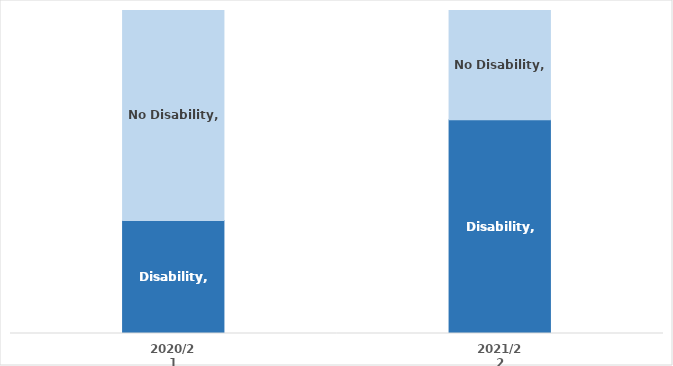
| Category | Disability | No Disability |
|---|---|---|
| 2020/21 | 0.35 | 0.65 |
| 2021/22 | 0.661 | 0.339 |